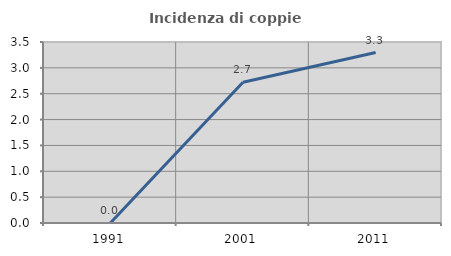
| Category | Incidenza di coppie miste |
|---|---|
| 1991.0 | 0 |
| 2001.0 | 2.721 |
| 2011.0 | 3.297 |